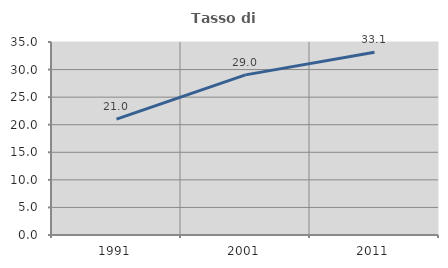
| Category | Tasso di occupazione   |
|---|---|
| 1991.0 | 21 |
| 2001.0 | 29.039 |
| 2011.0 | 33.149 |